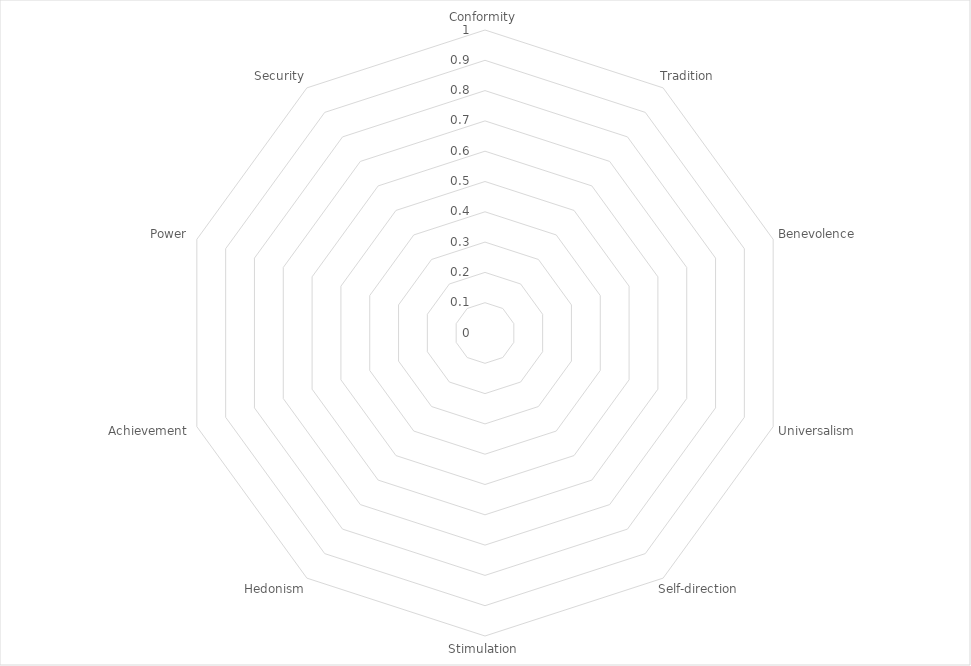
| Category | Series 0 |
|---|---|
| Conformity | 0 |
| Tradition | 0 |
| Benevolence | 0 |
| Universalism | 0 |
| Self-direction | 0 |
| Stimulation | 0 |
| Hedonism | 0 |
| Achievement | 0 |
| Power | 0 |
| Security | 0 |